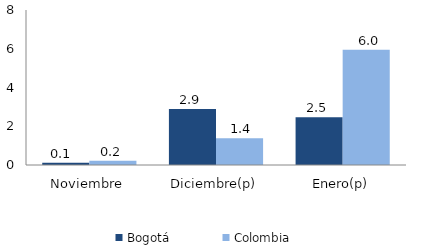
| Category | Bogotá | Colombia |
|---|---|---|
| Noviembre | 0.11 | 0.224 |
| Diciembre(p) | 2.894 | 1.385 |
| Enero(p) | 2.466 | 5.953 |